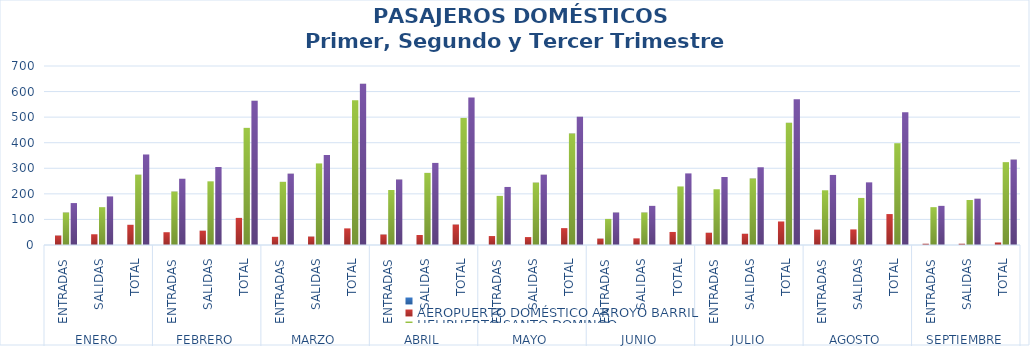
| Category | Series 0 | AEROPUERTO DOMÉSTICO ARROYO BARRIL | HELIPUERTO SANTO DOMINGO | TOTAL |
|---|---|---|---|---|
| 0 |  | 37 | 127 | 164 |
| 1 |  | 42 | 148 | 190 |
| 2 |  | 79 | 275 | 354 |
| 3 |  | 50 | 209 | 259 |
| 4 |  | 56 | 249 | 305 |
| 5 |  | 106 | 458 | 564 |
| 6 |  | 32 | 247 | 279 |
| 7 |  | 33 | 319 | 352 |
| 8 |  | 65 | 566 | 631 |
| 9 |  | 41 | 215 | 256 |
| 10 |  | 39 | 282 | 321 |
| 11 |  | 80 | 497 | 577 |
| 12 |  | 35 | 192 | 227 |
| 13 |  | 31 | 244 | 275 |
| 14 |  | 66 | 436 | 502 |
| 15 |  | 25 | 102 | 127 |
| 16 |  | 26 | 127 | 153 |
| 17 |  | 51 | 229 | 280 |
| 18 |  | 48 | 218 | 266 |
| 19 |  | 44 | 260 | 304 |
| 20 |  | 92 | 478 | 570 |
| 21 |  | 60 | 214 | 274 |
| 22 |  | 61 | 184 | 245 |
| 23 |  | 121 | 398 | 519 |
| 24 |  | 5 | 148 | 153 |
| 25 |  | 5 | 176 | 181 |
| 26 |  | 10 | 324 | 334 |